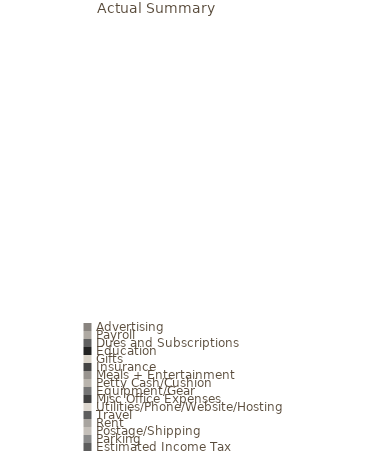
| Category | Yearly |
|---|---|
| Advertising | 0 |
| Payroll | 0 |
| Dues and Subscriptions | 0 |
| Education | 0 |
| Gifts | 0 |
| Insurance | 0 |
| Meals + Entertainment | 0 |
| Petty Cash/Cushion | 0 |
| Equipment/Gear | 0 |
| Misc Office Expenses | 0 |
| Utilities/Phone/Website/Hosting | 0 |
| Travel | 0 |
| Rent | 0 |
| Postage/Shipping | 0 |
| Parking | 0 |
| Estimated Income Tax | 0 |